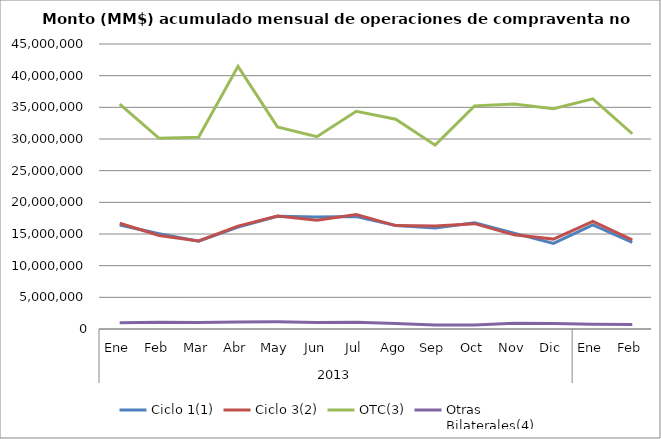
| Category | Ciclo 1(1) | Ciclo 3(2) | OTC(3) | Otras
Bilaterales(4) |
|---|---|---|---|---|
| 0 | 16417241.727 | 16700335.202 | 35523809.408 | 972958.086 |
| 1 | 15037741.172 | 14773657.586 | 30102338.851 | 1073496.596 |
| 2 | 13848943.779 | 13900402.205 | 30273669.122 | 1026617.054 |
| 3 | 16086096.035 | 16245696.168 | 41465554.082 | 1105720.368 |
| 4 | 17801790.619 | 17838763.351 | 31909646.654 | 1133512.85 |
| 5 | 17684542.956 | 17179330.609 | 30372188.279 | 1025162.543 |
| 6 | 17771623.451 | 18089502.524 | 34376831.202 | 1053340.718 |
| 7 | 16359818.954 | 16327115.519 | 33128143.288 | 882723.558 |
| 8 | 15949862.744 | 16281684.387 | 29025705.039 | 624893.462 |
| 9 | 16760948.703 | 16634867.291 | 35234004.542 | 641647.876 |
| 10 | 15133528.556 | 14863555.208 | 35512550.02 | 915020.525 |
| 11 | 13509827.678 | 14192849.668 | 34769513.126 | 877765.247 |
| 12 | 16434121.823 | 16973216.875 | 36341658.718 | 750147.378 |
| 13 | 13675521.943 | 14060199.134 | 30828680.35 | 721919.806 |